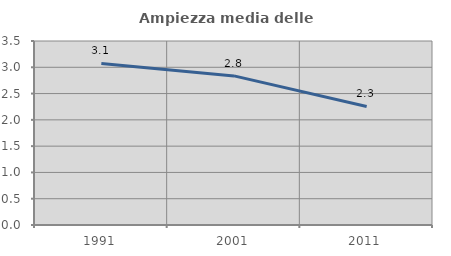
| Category | Ampiezza media delle famiglie |
|---|---|
| 1991.0 | 3.074 |
| 2001.0 | 2.836 |
| 2011.0 | 2.254 |